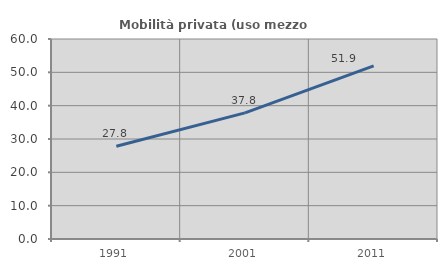
| Category | Mobilità privata (uso mezzo privato) |
|---|---|
| 1991.0 | 27.825 |
| 2001.0 | 37.844 |
| 2011.0 | 51.941 |